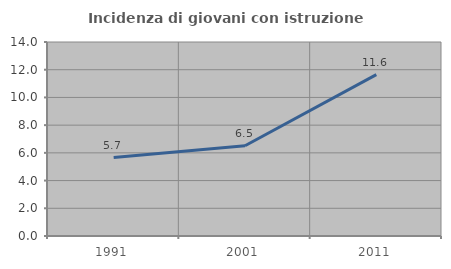
| Category | Incidenza di giovani con istruzione universitaria |
|---|---|
| 1991.0 | 5.658 |
| 2001.0 | 6.515 |
| 2011.0 | 11.645 |